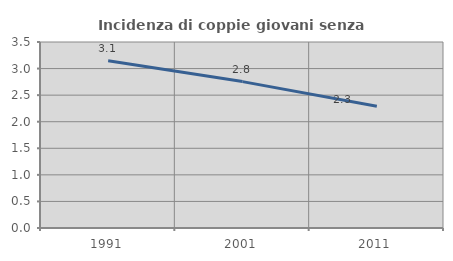
| Category | Incidenza di coppie giovani senza figli |
|---|---|
| 1991.0 | 3.146 |
| 2001.0 | 2.755 |
| 2011.0 | 2.29 |